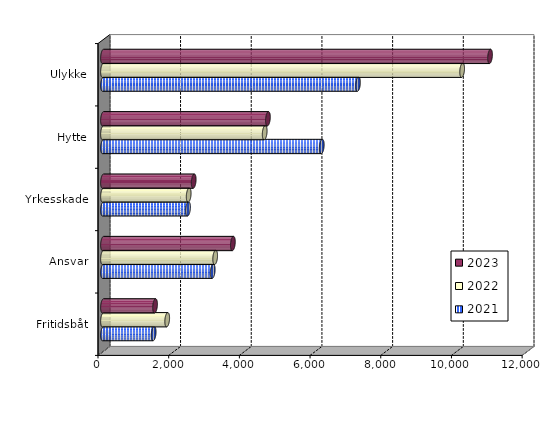
| Category | 2021 | 2022 | 2023 |
|---|---|---|---|
| Fritidsbåt | 1433.31 | 1816.335 | 1472.777 |
| Ansvar | 3104.315 | 3173.582 | 3674.731 |
| Yrkesskade | 2405.707 | 2424.515 | 2566.459 |
| Hytte | 6189.859 | 4575 | 4666 |
| Ulykke | 7214.344 | 10160.967 | 10950.025 |